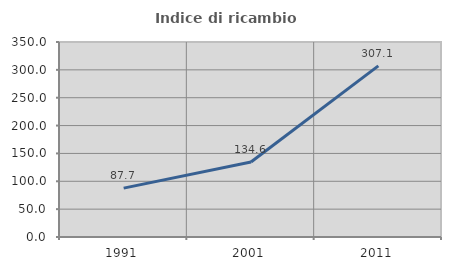
| Category | Indice di ricambio occupazionale  |
|---|---|
| 1991.0 | 87.719 |
| 2001.0 | 134.615 |
| 2011.0 | 307.143 |